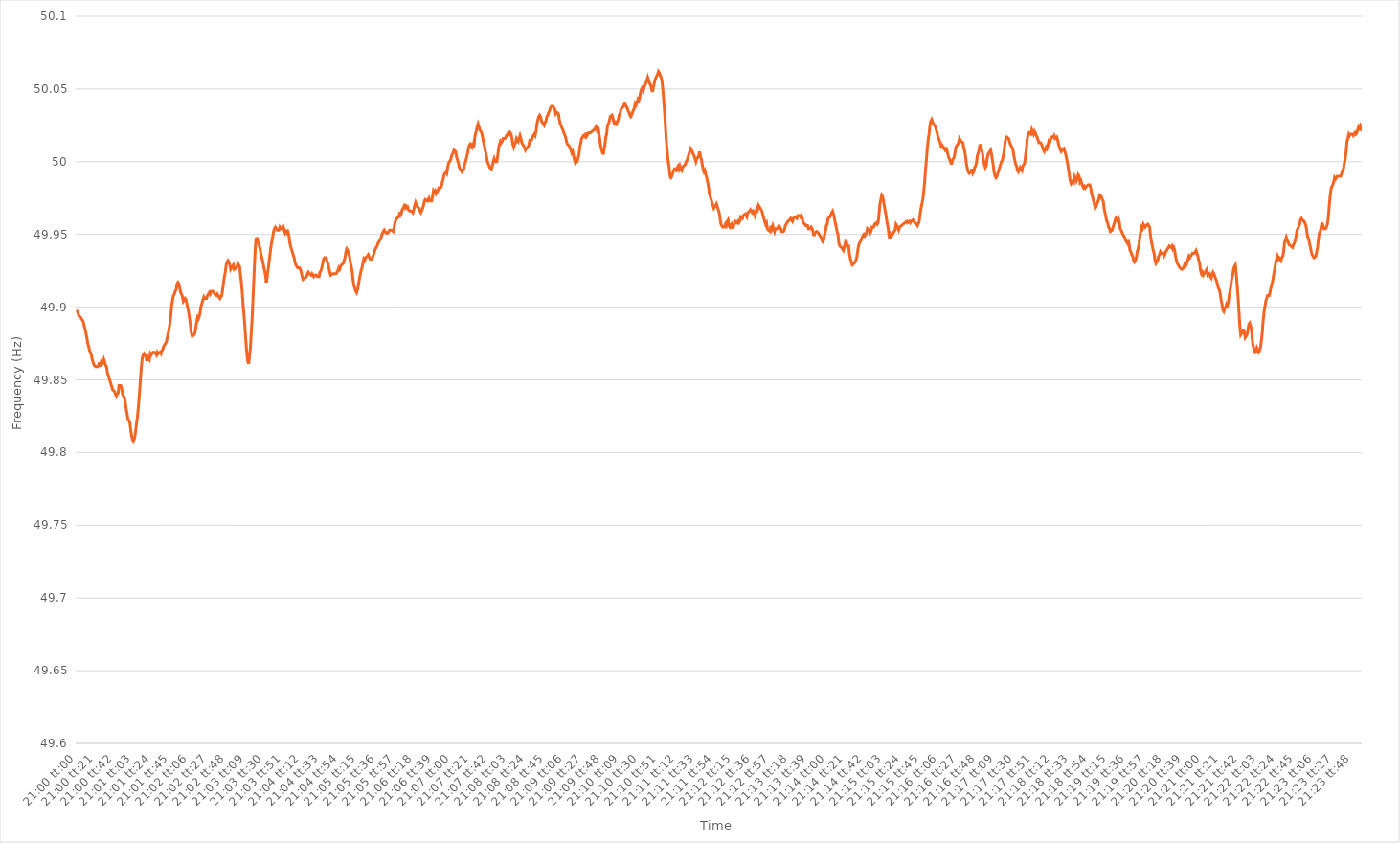
| Category | Series 0 |
|---|---|
| 0.875 | 49.898 |
| 0.8750115740740741 | 49.896 |
| 0.8750231481481481 | 49.894 |
| 0.8750347222222222 | 49.894 |
| 0.8750462962962963 | 49.893 |
| 0.8750578703703704 | 49.892 |
| 0.8750694444444443 | 49.891 |
| 0.8750810185185185 | 49.89 |
| 0.8750925925925926 | 49.887 |
| 0.8751041666666667 | 49.885 |
| 0.8751157407407407 | 49.882 |
| 0.8751273148148148 | 49.879 |
| 0.8751388888888889 | 49.875 |
| 0.8751504629629631 | 49.873 |
| 0.875162037037037 | 49.87 |
| 0.8751736111111111 | 49.869 |
| 0.8751851851851852 | 49.867 |
| 0.8751967592592593 | 49.864 |
| 0.8752083333333333 | 49.862 |
| 0.8752199074074074 | 49.86 |
| 0.8752314814814816 | 49.86 |
| 0.8752430555555555 | 49.859 |
| 0.8752546296296296 | 49.859 |
| 0.8752662037037037 | 49.859 |
| 0.8752777777777778 | 49.86 |
| 0.8752893518518517 | 49.862 |
| 0.8753009259259259 | 49.859 |
| 0.8753125 | 49.862 |
| 0.8753240740740741 | 49.861 |
| 0.8753356481481481 | 49.862 |
| 0.8753472222222222 | 49.864 |
| 0.8753587962962963 | 49.862 |
| 0.8753703703703705 | 49.86 |
| 0.8753819444444444 | 49.859 |
| 0.8753935185185185 | 49.855 |
| 0.8754050925925926 | 49.853 |
| 0.8754166666666667 | 49.851 |
| 0.8754282407407407 | 49.849 |
| 0.8754398148148148 | 49.847 |
| 0.875451388888889 | 49.845 |
| 0.875462962962963 | 49.843 |
| 0.875474537037037 | 49.843 |
| 0.8754861111111111 | 49.842 |
| 0.8754976851851852 | 49.84 |
| 0.8755092592592592 | 49.839 |
| 0.8755208333333333 | 49.84 |
| 0.8755324074074075 | 49.841 |
| 0.8755439814814815 | 49.846 |
| 0.8755555555555555 | 49.846 |
| 0.8755671296296296 | 49.846 |
| 0.8755787037037037 | 49.844 |
| 0.8755902777777779 | 49.84 |
| 0.8756018518518518 | 49.839 |
| 0.875613425925926 | 49.838 |
| 0.875625 | 49.835 |
| 0.8756365740740741 | 49.83 |
| 0.8756481481481481 | 49.827 |
| 0.8756597222222222 | 49.823 |
| 0.8756712962962964 | 49.823 |
| 0.8756828703703704 | 49.821 |
| 0.8756944444444444 | 49.816 |
| 0.8757060185185185 | 49.812 |
| 0.8757175925925926 | 49.809 |
| 0.8757291666666666 | 49.808 |
| 0.8757407407407407 | 49.809 |
| 0.8757523148148149 | 49.812 |
| 0.8757638888888889 | 49.817 |
| 0.8757754629629629 | 49.822 |
| 0.875787037037037 | 49.827 |
| 0.8757986111111111 | 49.834 |
| 0.8758101851851853 | 49.842 |
| 0.8758217592592592 | 49.851 |
| 0.8758333333333334 | 49.859 |
| 0.8758449074074074 | 49.865 |
| 0.8758564814814815 | 49.867 |
| 0.8758680555555555 | 49.868 |
| 0.8758796296296296 | 49.867 |
| 0.8758912037037038 | 49.866 |
| 0.8759027777777778 | 49.863 |
| 0.8759143518518518 | 49.866 |
| 0.8759259259259259 | 49.865 |
| 0.8759375 | 49.864 |
| 0.875949074074074 | 49.868 |
| 0.8759606481481481 | 49.867 |
| 0.8759722222222223 | 49.868 |
| 0.8759837962962963 | 49.869 |
| 0.8759953703703703 | 49.869 |
| 0.8760069444444444 | 49.869 |
| 0.8760185185185185 | 49.869 |
| 0.8760300925925927 | 49.867 |
| 0.8760416666666666 | 49.869 |
| 0.8760532407407408 | 49.868 |
| 0.8760648148148148 | 49.868 |
| 0.876076388888889 | 49.869 |
| 0.8760879629629629 | 49.868 |
| 0.876099537037037 | 49.87 |
| 0.8761111111111112 | 49.871 |
| 0.8761226851851852 | 49.873 |
| 0.8761342592592593 | 49.873 |
| 0.8761458333333333 | 49.875 |
| 0.8761574074074074 | 49.876 |
| 0.8761689814814816 | 49.879 |
| 0.8761805555555555 | 49.882 |
| 0.8761921296296297 | 49.885 |
| 0.8762037037037037 | 49.889 |
| 0.8762152777777777 | 49.894 |
| 0.8762268518518518 | 49.901 |
| 0.8762384259259259 | 49.905 |
| 0.8762500000000001 | 49.908 |
| 0.876261574074074 | 49.909 |
| 0.8762731481481482 | 49.911 |
| 0.8762847222222222 | 49.912 |
| 0.8762962962962964 | 49.916 |
| 0.8763078703703703 | 49.917 |
| 0.8763194444444444 | 49.916 |
| 0.8763310185185186 | 49.913 |
| 0.8763425925925926 | 49.91 |
| 0.8763541666666667 | 49.909 |
| 0.8763657407407407 | 49.907 |
| 0.8763773148148148 | 49.904 |
| 0.876388888888889 | 49.905 |
| 0.8764004629629629 | 49.906 |
| 0.8764120370370371 | 49.905 |
| 0.8764236111111111 | 49.902 |
| 0.8764351851851852 | 49.899 |
| 0.8764467592592592 | 49.896 |
| 0.8764583333333333 | 49.892 |
| 0.8764699074074075 | 49.887 |
| 0.8764814814814814 | 49.882 |
| 0.8764930555555556 | 49.88 |
| 0.8765046296296296 | 49.88 |
| 0.8765162037037038 | 49.881 |
| 0.8765277777777777 | 49.882 |
| 0.8765393518518518 | 49.886 |
| 0.876550925925926 | 49.89 |
| 0.8765625 | 49.893 |
| 0.8765740740740741 | 49.892 |
| 0.8765856481481481 | 49.894 |
| 0.8765972222222222 | 49.897 |
| 0.8766087962962964 | 49.901 |
| 0.8766203703703703 | 49.903 |
| 0.8766319444444445 | 49.905 |
| 0.8766435185185185 | 49.907 |
| 0.8766550925925927 | 49.906 |
| 0.8766666666666666 | 49.906 |
| 0.8766782407407407 | 49.906 |
| 0.8766898148148149 | 49.908 |
| 0.8767013888888888 | 49.909 |
| 0.876712962962963 | 49.91 |
| 0.876724537037037 | 49.909 |
| 0.8767361111111112 | 49.911 |
| 0.8767476851851851 | 49.911 |
| 0.8767592592592592 | 49.911 |
| 0.8767708333333334 | 49.911 |
| 0.8767824074074074 | 49.909 |
| 0.8767939814814815 | 49.909 |
| 0.8768055555555555 | 49.908 |
| 0.8768171296296297 | 49.909 |
| 0.8768287037037038 | 49.909 |
| 0.8768402777777777 | 49.907 |
| 0.8768518518518519 | 49.906 |
| 0.8768634259259259 | 49.906 |
| 0.8768750000000001 | 49.908 |
| 0.876886574074074 | 49.912 |
| 0.8768981481481481 | 49.917 |
| 0.8769097222222223 | 49.921 |
| 0.8769212962962962 | 49.924 |
| 0.8769328703703704 | 49.929 |
| 0.8769444444444444 | 49.931 |
| 0.8769560185185186 | 49.932 |
| 0.8769675925925925 | 49.931 |
| 0.8769791666666666 | 49.929 |
| 0.8769907407407408 | 49.926 |
| 0.8770023148148148 | 49.926 |
| 0.8770138888888889 | 49.928 |
| 0.8770254629629629 | 49.929 |
| 0.8770370370370371 | 49.926 |
| 0.8770486111111112 | 49.926 |
| 0.8770601851851851 | 49.927 |
| 0.8770717592592593 | 49.928 |
| 0.8770833333333333 | 49.93 |
| 0.8770949074074075 | 49.93 |
| 0.8771064814814814 | 49.928 |
| 0.8771180555555556 | 49.922 |
| 0.8771296296296297 | 49.917 |
| 0.8771412037037036 | 49.91 |
| 0.8771527777777778 | 49.901 |
| 0.8771643518518518 | 49.894 |
| 0.877175925925926 | 49.886 |
| 0.8771874999999999 | 49.877 |
| 0.877199074074074 | 49.869 |
| 0.8772106481481482 | 49.863 |
| 0.8772222222222222 | 49.861 |
| 0.8772337962962963 | 49.867 |
| 0.8772453703703703 | 49.871 |
| 0.8772569444444445 | 49.882 |
| 0.8772685185185186 | 49.892 |
| 0.8772800925925925 | 49.906 |
| 0.8772916666666667 | 49.92 |
| 0.8773032407407407 | 49.934 |
| 0.8773148148148149 | 49.945 |
| 0.8773263888888888 | 49.948 |
| 0.877337962962963 | 49.946 |
| 0.8773495370370371 | 49.944 |
| 0.8773611111111111 | 49.942 |
| 0.8773726851851852 | 49.94 |
| 0.8773842592592592 | 49.936 |
| 0.8773958333333334 | 49.934 |
| 0.8774074074074073 | 49.931 |
| 0.8774189814814815 | 49.928 |
| 0.8774305555555556 | 49.925 |
| 0.8774421296296296 | 49.922 |
| 0.8774537037037037 | 49.917 |
| 0.8774652777777777 | 49.922 |
| 0.8774768518518519 | 49.926 |
| 0.877488425925926 | 49.931 |
| 0.8775 | 49.936 |
| 0.8775115740740741 | 49.941 |
| 0.8775231481481481 | 49.945 |
| 0.8775347222222223 | 49.948 |
| 0.8775462962962962 | 49.952 |
| 0.8775578703703704 | 49.954 |
| 0.8775694444444445 | 49.955 |
| 0.8775810185185186 | 49.954 |
| 0.8775925925925926 | 49.953 |
| 0.8776041666666666 | 49.953 |
| 0.8776157407407408 | 49.953 |
| 0.8776273148148147 | 49.955 |
| 0.8776388888888889 | 49.954 |
| 0.877650462962963 | 49.954 |
| 0.877662037037037 | 49.954 |
| 0.8776736111111111 | 49.955 |
| 0.8776851851851851 | 49.955 |
| 0.8776967592592593 | 49.951 |
| 0.8777083333333334 | 49.952 |
| 0.8777199074074074 | 49.951 |
| 0.8777314814814815 | 49.952 |
| 0.8777430555555555 | 49.95 |
| 0.8777546296296297 | 49.945 |
| 0.8777662037037036 | 49.942 |
| 0.8777777777777778 | 49.94 |
| 0.8777893518518519 | 49.938 |
| 0.877800925925926 | 49.936 |
| 0.8778125 | 49.934 |
| 0.877824074074074 | 49.931 |
| 0.8778356481481482 | 49.929 |
| 0.8778472222222221 | 49.928 |
| 0.8778587962962963 | 49.927 |
| 0.8778703703703704 | 49.927 |
| 0.8778819444444445 | 49.927 |
| 0.8778935185185185 | 49.926 |
| 0.8779050925925925 | 49.924 |
| 0.8779166666666667 | 49.921 |
| 0.8779282407407408 | 49.919 |
| 0.8779398148148148 | 49.919 |
| 0.8779513888888889 | 49.92 |
| 0.877962962962963 | 49.92 |
| 0.8779745370370371 | 49.921 |
| 0.877986111111111 | 49.923 |
| 0.8779976851851852 | 49.924 |
| 0.8780092592592593 | 49.923 |
| 0.8780208333333334 | 49.923 |
| 0.8780324074074074 | 49.922 |
| 0.8780439814814814 | 49.923 |
| 0.8780555555555556 | 49.923 |
| 0.8780671296296297 | 49.921 |
| 0.8780787037037037 | 49.922 |
| 0.8780902777777778 | 49.922 |
| 0.8781018518518519 | 49.922 |
| 0.8781134259259259 | 49.921 |
| 0.8781249999999999 | 49.921 |
| 0.8781365740740741 | 49.921 |
| 0.8781481481481482 | 49.924 |
| 0.8781597222222222 | 49.925 |
| 0.8781712962962963 | 49.927 |
| 0.8781828703703703 | 49.93 |
| 0.8781944444444445 | 49.933 |
| 0.8782060185185184 | 49.934 |
| 0.8782175925925926 | 49.934 |
| 0.8782291666666667 | 49.934 |
| 0.8782407407407408 | 49.931 |
| 0.8782523148148148 | 49.93 |
| 0.8782638888888888 | 49.927 |
| 0.878275462962963 | 49.924 |
| 0.8782870370370371 | 49.922 |
| 0.8782986111111111 | 49.922 |
| 0.8783101851851852 | 49.923 |
| 0.8783217592592593 | 49.923 |
| 0.8783333333333333 | 49.923 |
| 0.8783449074074073 | 49.923 |
| 0.8783564814814815 | 49.923 |
| 0.8783680555555556 | 49.923 |
| 0.8783796296296296 | 49.925 |
| 0.8783912037037037 | 49.927 |
| 0.8784027777777778 | 49.926 |
| 0.8784143518518519 | 49.928 |
| 0.8784259259259258 | 49.929 |
| 0.8784375 | 49.929 |
| 0.8784490740740741 | 49.93 |
| 0.8784606481481482 | 49.932 |
| 0.8784722222222222 | 49.934 |
| 0.8784837962962962 | 49.938 |
| 0.8784953703703704 | 49.94 |
| 0.8785069444444445 | 49.939 |
| 0.8785185185185185 | 49.937 |
| 0.8785300925925926 | 49.935 |
| 0.8785416666666667 | 49.931 |
| 0.8785532407407407 | 49.928 |
| 0.8785648148148147 | 49.925 |
| 0.8785763888888889 | 49.919 |
| 0.878587962962963 | 49.915 |
| 0.878599537037037 | 49.913 |
| 0.8786111111111111 | 49.911 |
| 0.8786226851851852 | 49.91 |
| 0.8786342592592593 | 49.912 |
| 0.8786458333333332 | 49.915 |
| 0.8786574074074074 | 49.919 |
| 0.8786689814814815 | 49.922 |
| 0.8786805555555556 | 49.925 |
| 0.8786921296296296 | 49.927 |
| 0.8787037037037037 | 49.93 |
| 0.8787152777777778 | 49.933 |
| 0.878726851851852 | 49.932 |
| 0.8787384259259259 | 49.934 |
| 0.87875 | 49.934 |
| 0.8787615740740741 | 49.935 |
| 0.8787731481481482 | 49.936 |
| 0.8787847222222221 | 49.936 |
| 0.8787962962962963 | 49.933 |
| 0.8788078703703704 | 49.933 |
| 0.8788194444444444 | 49.933 |
| 0.8788310185185185 | 49.933 |
| 0.8788425925925926 | 49.936 |
| 0.8788541666666667 | 49.938 |
| 0.8788657407407406 | 49.94 |
| 0.8788773148148148 | 49.941 |
| 0.8788888888888889 | 49.942 |
| 0.878900462962963 | 49.944 |
| 0.878912037037037 | 49.945 |
| 0.8789236111111111 | 49.945 |
| 0.8789351851851852 | 49.947 |
| 0.8789467592592594 | 49.949 |
| 0.8789583333333333 | 49.951 |
| 0.8789699074074074 | 49.952 |
| 0.8789814814814815 | 49.953 |
| 0.8789930555555556 | 49.953 |
| 0.8790046296296296 | 49.951 |
| 0.8790162037037037 | 49.951 |
| 0.8790277777777779 | 49.951 |
| 0.8790393518518518 | 49.951 |
| 0.8790509259259259 | 49.953 |
| 0.8790625 | 49.953 |
| 0.8790740740740741 | 49.953 |
| 0.879085648148148 | 49.953 |
| 0.8790972222222222 | 49.952 |
| 0.8791087962962963 | 49.955 |
| 0.8791203703703704 | 49.958 |
| 0.8791319444444444 | 49.96 |
| 0.8791435185185185 | 49.961 |
| 0.8791550925925926 | 49.961 |
| 0.8791666666666668 | 49.962 |
| 0.8791782407407407 | 49.964 |
| 0.8791898148148148 | 49.963 |
| 0.8792013888888889 | 49.964 |
| 0.879212962962963 | 49.967 |
| 0.879224537037037 | 49.968 |
| 0.8792361111111111 | 49.969 |
| 0.8792476851851853 | 49.971 |
| 0.8792592592592593 | 49.968 |
| 0.8792708333333333 | 49.968 |
| 0.8792824074074074 | 49.969 |
| 0.8792939814814815 | 49.967 |
| 0.8793055555555555 | 49.967 |
| 0.8793171296296296 | 49.966 |
| 0.8793287037037038 | 49.966 |
| 0.8793402777777778 | 49.966 |
| 0.8793518518518518 | 49.965 |
| 0.8793634259259259 | 49.967 |
| 0.879375 | 49.97 |
| 0.8793865740740742 | 49.972 |
| 0.8793981481481481 | 49.972 |
| 0.8794097222222222 | 49.969 |
| 0.8794212962962963 | 49.969 |
| 0.8794328703703704 | 49.968 |
| 0.8794444444444444 | 49.966 |
| 0.8794560185185185 | 49.965 |
| 0.8794675925925927 | 49.965 |
| 0.8794791666666667 | 49.968 |
| 0.8794907407407407 | 49.97 |
| 0.8795023148148148 | 49.973 |
| 0.8795138888888889 | 49.974 |
| 0.8795254629629629 | 49.974 |
| 0.879537037037037 | 49.973 |
| 0.8795486111111112 | 49.974 |
| 0.8795601851851852 | 49.975 |
| 0.8795717592592592 | 49.973 |
| 0.8795833333333333 | 49.973 |
| 0.8795949074074074 | 49.973 |
| 0.8796064814814816 | 49.976 |
| 0.8796180555555555 | 49.98 |
| 0.8796296296296297 | 49.979 |
| 0.8796412037037037 | 49.98 |
| 0.8796527777777778 | 49.978 |
| 0.8796643518518518 | 49.979 |
| 0.8796759259259259 | 49.98 |
| 0.8796875000000001 | 49.982 |
| 0.8796990740740741 | 49.982 |
| 0.8797106481481481 | 49.982 |
| 0.8797222222222222 | 49.983 |
| 0.8797337962962963 | 49.986 |
| 0.8797453703703703 | 49.988 |
| 0.8797569444444444 | 49.991 |
| 0.8797685185185186 | 49.991 |
| 0.8797800925925926 | 49.993 |
| 0.8797916666666666 | 49.992 |
| 0.8798032407407407 | 49.996 |
| 0.8798148148148148 | 49.999 |
| 0.879826388888889 | 50 |
| 0.8798379629629629 | 50.001 |
| 0.879849537037037 | 50.003 |
| 0.8798611111111111 | 50.005 |
| 0.8798726851851852 | 50.006 |
| 0.8798842592592592 | 50.008 |
| 0.8798958333333333 | 50.008 |
| 0.8799074074074075 | 50.007 |
| 0.8799189814814815 | 50.003 |
| 0.8799305555555555 | 50.001 |
| 0.8799421296296296 | 49.999 |
| 0.8799537037037037 | 49.996 |
| 0.8799652777777779 | 49.995 |
| 0.8799768518518518 | 49.995 |
| 0.879988425925926 | 49.993 |
| 0.88 | 49.994 |
| 0.880011574074074 | 49.995 |
| 0.8800231481481481 | 49.998 |
| 0.8800347222222222 | 50 |
| 0.8800462962962964 | 50 |
| 0.8800578703703703 | 50.005 |
| 0.8800694444444445 | 50.008 |
| 0.8800810185185185 | 50.011 |
| 0.8800925925925926 | 50.012 |
| 0.8801041666666666 | 50.012 |
| 0.8801157407407407 | 50.01 |
| 0.8801273148148149 | 50.013 |
| 0.8801388888888889 | 50.01 |
| 0.880150462962963 | 50.015 |
| 0.880162037037037 | 50.019 |
| 0.8801736111111111 | 50.021 |
| 0.8801851851851853 | 50.024 |
| 0.8801967592592592 | 50.026 |
| 0.8802083333333334 | 50.024 |
| 0.8802199074074074 | 50.022 |
| 0.8802314814814814 | 50.021 |
| 0.8802430555555555 | 50.02 |
| 0.8802546296296296 | 50.017 |
| 0.8802662037037038 | 50.014 |
| 0.8802777777777777 | 50.011 |
| 0.8802893518518519 | 50.008 |
| 0.8803009259259259 | 50.005 |
| 0.8803125 | 50.002 |
| 0.880324074074074 | 49.999 |
| 0.8803356481481481 | 49.998 |
| 0.8803472222222223 | 49.996 |
| 0.8803587962962963 | 49.996 |
| 0.8803703703703704 | 49.995 |
| 0.8803819444444444 | 49.997 |
| 0.8803935185185185 | 50 |
| 0.8804050925925927 | 50.002 |
| 0.8804166666666666 | 50 |
| 0.8804282407407408 | 50 |
| 0.8804398148148148 | 50 |
| 0.8804513888888889 | 50.004 |
| 0.8804629629629629 | 50.009 |
| 0.880474537037037 | 50.012 |
| 0.8804861111111112 | 50.014 |
| 0.8804976851851851 | 50.013 |
| 0.8805092592592593 | 50.014 |
| 0.8805208333333333 | 50.016 |
| 0.8805324074074075 | 50.016 |
| 0.8805439814814814 | 50.016 |
| 0.8805555555555555 | 50.017 |
| 0.8805671296296297 | 50.018 |
| 0.8805787037037037 | 50.019 |
| 0.8805902777777778 | 50.02 |
| 0.8806018518518518 | 50.019 |
| 0.880613425925926 | 50.02 |
| 0.8806250000000001 | 50.019 |
| 0.880636574074074 | 50.016 |
| 0.8806481481481482 | 50.012 |
| 0.8806597222222222 | 50.01 |
| 0.8806712962962964 | 50.012 |
| 0.8806828703703703 | 50.013 |
| 0.8806944444444444 | 50.016 |
| 0.8807060185185186 | 50.015 |
| 0.8807175925925925 | 50.014 |
| 0.8807291666666667 | 50.016 |
| 0.8807407407407407 | 50.018 |
| 0.8807523148148149 | 50.016 |
| 0.8807638888888888 | 50.013 |
| 0.8807754629629629 | 50.012 |
| 0.8807870370370371 | 50.012 |
| 0.8807986111111111 | 50.01 |
| 0.8808101851851852 | 50.008 |
| 0.8808217592592592 | 50.009 |
| 0.8808333333333334 | 50.009 |
| 0.8808449074074075 | 50.01 |
| 0.8808564814814814 | 50.012 |
| 0.8808680555555556 | 50.015 |
| 0.8808796296296296 | 50.015 |
| 0.8808912037037038 | 50.015 |
| 0.8809027777777777 | 50.017 |
| 0.8809143518518519 | 50.018 |
| 0.880925925925926 | 50.019 |
| 0.8809374999999999 | 50.018 |
| 0.8809490740740741 | 50.021 |
| 0.8809606481481481 | 50.026 |
| 0.8809722222222223 | 50.029 |
| 0.8809837962962962 | 50.031 |
| 0.8809953703703703 | 50.032 |
| 0.8810069444444445 | 50.031 |
| 0.8810185185185185 | 50.028 |
| 0.8810300925925926 | 50.027 |
| 0.8810416666666666 | 50.026 |
| 0.8810532407407408 | 50.025 |
| 0.8810648148148149 | 50.027 |
| 0.8810763888888888 | 50.028 |
| 0.881087962962963 | 50.031 |
| 0.881099537037037 | 50.032 |
| 0.8811111111111112 | 50.032 |
| 0.8811226851851851 | 50.035 |
| 0.8811342592592593 | 50.037 |
| 0.8811458333333334 | 50.038 |
| 0.8811574074074073 | 50.038 |
| 0.8811689814814815 | 50.038 |
| 0.8811805555555555 | 50.037 |
| 0.8811921296296297 | 50.036 |
| 0.8812037037037036 | 50.033 |
| 0.8812152777777778 | 50.034 |
| 0.8812268518518519 | 50.034 |
| 0.8812384259259259 | 50.033 |
| 0.88125 | 50.029 |
| 0.881261574074074 | 50.026 |
| 0.8812731481481482 | 50.025 |
| 0.8812847222222223 | 50.023 |
| 0.8812962962962962 | 50.022 |
| 0.8813078703703704 | 50.02 |
| 0.8813194444444444 | 50.02 |
| 0.8813310185185186 | 50.017 |
| 0.8813425925925925 | 50.014 |
| 0.8813541666666667 | 50.012 |
| 0.8813657407407408 | 50.012 |
| 0.8813773148148148 | 50.011 |
| 0.8813888888888889 | 50.009 |
| 0.8814004629629629 | 50.008 |
| 0.8814120370370371 | 50.006 |
| 0.881423611111111 | 50.007 |
| 0.8814351851851852 | 50.007 |
| 0.8814467592592593 | 50.001 |
| 0.8814583333333333 | 49.999 |
| 0.8814699074074074 | 49.999 |
| 0.8814814814814814 | 50 |
| 0.8814930555555556 | 50 |
| 0.8815046296296297 | 50.005 |
| 0.8815162037037036 | 50.01 |
| 0.8815277777777778 | 50.013 |
| 0.8815393518518518 | 50.016 |
| 0.881550925925926 | 50.016 |
| 0.8815624999999999 | 50.018 |
| 0.8815740740740741 | 50.018 |
| 0.8815856481481482 | 50.017 |
| 0.8815972222222223 | 50.02 |
| 0.8816087962962963 | 50.018 |
| 0.8816203703703703 | 50.018 |
| 0.8816319444444445 | 50.02 |
| 0.8816435185185184 | 50.02 |
| 0.8816550925925926 | 50.02 |
| 0.8816666666666667 | 50.02 |
| 0.8816782407407407 | 50.021 |
| 0.8816898148148148 | 50.021 |
| 0.8817013888888888 | 50.022 |
| 0.881712962962963 | 50.022 |
| 0.8817245370370371 | 50.024 |
| 0.881736111111111 | 50.022 |
| 0.8817476851851852 | 50.024 |
| 0.8817592592592592 | 50.021 |
| 0.8817708333333334 | 50.017 |
| 0.8817824074074073 | 50.012 |
| 0.8817939814814815 | 50.009 |
| 0.8818055555555556 | 50.007 |
| 0.8818171296296297 | 50.005 |
| 0.8818287037037037 | 50.008 |
| 0.8818402777777777 | 50.011 |
| 0.8818518518518519 | 50.017 |
| 0.881863425925926 | 50.019 |
| 0.881875 | 50.025 |
| 0.8818865740740741 | 50.026 |
| 0.8818981481481482 | 50.028 |
| 0.8819097222222222 | 50.031 |
| 0.8819212962962962 | 50.031 |
| 0.8819328703703704 | 50.032 |
| 0.8819444444444445 | 50.03 |
| 0.8819560185185185 | 50.027 |
| 0.8819675925925926 | 50.026 |
| 0.8819791666666666 | 50.027 |
| 0.8819907407407408 | 50.026 |
| 0.8820023148148147 | 50.026 |
| 0.8820138888888889 | 50.029 |
| 0.882025462962963 | 50.032 |
| 0.8820370370370371 | 50.033 |
| 0.8820486111111111 | 50.036 |
| 0.8820601851851851 | 50.037 |
| 0.8820717592592593 | 50.037 |
| 0.8820833333333334 | 50.038 |
| 0.8820949074074074 | 50.041 |
| 0.8821064814814815 | 50.039 |
| 0.8821180555555556 | 50.039 |
| 0.8821296296296296 | 50.037 |
| 0.8821412037037036 | 50.035 |
| 0.8821527777777778 | 50.034 |
| 0.8821643518518519 | 50.032 |
| 0.8821759259259259 | 50.031 |
| 0.8821875 | 50.032 |
| 0.882199074074074 | 50.034 |
| 0.8822106481481482 | 50.034 |
| 0.8822222222222221 | 50.037 |
| 0.8822337962962963 | 50.04 |
| 0.8822453703703704 | 50.039 |
| 0.8822569444444445 | 50.039 |
| 0.8822685185185185 | 50.043 |
| 0.8822800925925925 | 50.042 |
| 0.8822916666666667 | 50.044 |
| 0.8823032407407408 | 50.048 |
| 0.8823148148148148 | 50.05 |
| 0.8823263888888889 | 50.051 |
| 0.882337962962963 | 50.049 |
| 0.882349537037037 | 50.051 |
| 0.882361111111111 | 50.053 |
| 0.8823726851851852 | 50.054 |
| 0.8823842592592593 | 50.056 |
| 0.8823958333333333 | 50.058 |
| 0.8824074074074074 | 50.058 |
| 0.8824189814814815 | 50.054 |
| 0.8824305555555556 | 50.053 |
| 0.8824421296296295 | 50.051 |
| 0.8824537037037037 | 50.048 |
| 0.8824652777777778 | 50.05 |
| 0.8824768518518519 | 50.053 |
| 0.8824884259259259 | 50.056 |
| 0.8825 | 50.056 |
| 0.8825115740740741 | 50.059 |
| 0.8825231481481483 | 50.06 |
| 0.8825347222222222 | 50.062 |
| 0.8825462962962963 | 50.061 |
| 0.8825578703703704 | 50.061 |
| 0.8825694444444445 | 50.058 |
| 0.8825810185185184 | 50.055 |
| 0.8825925925925926 | 50.049 |
| 0.8826041666666667 | 50.041 |
| 0.8826157407407407 | 50.033 |
| 0.8826273148148148 | 50.022 |
| 0.8826388888888889 | 50.013 |
| 0.882650462962963 | 50.006 |
| 0.8826620370370369 | 50 |
| 0.8826736111111111 | 49.996 |
| 0.8826851851851852 | 49.99 |
| 0.8826967592592593 | 49.989 |
| 0.8827083333333333 | 49.99 |
| 0.8827199074074074 | 49.99 |
| 0.8827314814814815 | 49.994 |
| 0.8827430555555557 | 49.995 |
| 0.8827546296296296 | 49.995 |
| 0.8827662037037037 | 49.994 |
| 0.8827777777777778 | 49.996 |
| 0.8827893518518519 | 49.997 |
| 0.8828009259259259 | 49.995 |
| 0.8828125 | 49.997 |
| 0.8828240740740741 | 49.995 |
| 0.8828356481481481 | 49.994 |
| 0.8828472222222222 | 49.996 |
| 0.8828587962962963 | 49.997 |
| 0.8828703703703704 | 49.997 |
| 0.8828819444444443 | 49.998 |
| 0.8828935185185185 | 50 |
| 0.8829050925925926 | 50.001 |
| 0.8829166666666667 | 50.003 |
| 0.8829282407407407 | 50.005 |
| 0.8829398148148148 | 50.005 |
| 0.8829513888888889 | 50.009 |
| 0.8829629629629631 | 50.009 |
| 0.882974537037037 | 50.007 |
| 0.8829861111111111 | 50.005 |
| 0.8829976851851852 | 50.004 |
| 0.8830092592592593 | 50.002 |
| 0.8830208333333333 | 50 |
| 0.8830324074074074 | 50.002 |
| 0.8830439814814816 | 50.003 |
| 0.8830555555555555 | 50.004 |
| 0.8830671296296296 | 50.007 |
| 0.8830787037037037 | 50.003 |
| 0.8830902777777778 | 50.002 |
| 0.8831018518518517 | 49.998 |
| 0.8831134259259259 | 49.995 |
| 0.883125 | 49.993 |
| 0.8831365740740741 | 49.994 |
| 0.8831481481481481 | 49.991 |
| 0.8831597222222222 | 49.989 |
| 0.8831712962962963 | 49.986 |
| 0.8831828703703705 | 49.983 |
| 0.8831944444444444 | 49.978 |
| 0.8832060185185185 | 49.978 |
| 0.8832175925925926 | 49.974 |
| 0.8832291666666667 | 49.972 |
| 0.8832407407407407 | 49.97 |
| 0.8832523148148148 | 49.968 |
| 0.883263888888889 | 49.968 |
| 0.883275462962963 | 49.97 |
| 0.883287037037037 | 49.971 |
| 0.8832986111111111 | 49.969 |
| 0.8833101851851852 | 49.969 |
| 0.8833217592592592 | 49.965 |
| 0.8833333333333333 | 49.961 |
| 0.8833449074074075 | 49.957 |
| 0.8833564814814815 | 49.956 |
| 0.8833680555555555 | 49.955 |
| 0.8833796296296296 | 49.955 |
| 0.8833912037037037 | 49.955 |
| 0.8834027777777779 | 49.957 |
| 0.8834143518518518 | 49.956 |
| 0.883425925925926 | 49.959 |
| 0.8834375 | 49.96 |
| 0.8834490740740741 | 49.956 |
| 0.8834606481481481 | 49.955 |
| 0.8834722222222222 | 49.956 |
| 0.8834837962962964 | 49.957 |
| 0.8834953703703704 | 49.954 |
| 0.8835069444444444 | 49.956 |
| 0.8835185185185185 | 49.957 |
| 0.8835300925925926 | 49.959 |
| 0.8835416666666666 | 49.959 |
| 0.8835532407407407 | 49.958 |
| 0.8835648148148149 | 49.959 |
| 0.8835763888888889 | 49.958 |
| 0.8835879629629629 | 49.959 |
| 0.883599537037037 | 49.962 |
| 0.8836111111111111 | 49.962 |
| 0.8836226851851853 | 49.961 |
| 0.8836342592592592 | 49.963 |
| 0.8836458333333334 | 49.963 |
| 0.8836574074074074 | 49.964 |
| 0.8836689814814815 | 49.963 |
| 0.8836805555555555 | 49.962 |
| 0.8836921296296296 | 49.965 |
| 0.8837037037037038 | 49.965 |
| 0.8837152777777778 | 49.966 |
| 0.8837268518518518 | 49.967 |
| 0.8837384259259259 | 49.967 |
| 0.88375 | 49.965 |
| 0.883761574074074 | 49.966 |
| 0.8837731481481481 | 49.965 |
| 0.8837847222222223 | 49.963 |
| 0.8837962962962963 | 49.965 |
| 0.8838078703703703 | 49.968 |
| 0.8838194444444444 | 49.967 |
| 0.8838310185185185 | 49.97 |
| 0.8838425925925927 | 49.97 |
| 0.8838541666666666 | 49.968 |
| 0.8838657407407408 | 49.967 |
| 0.8838773148148148 | 49.966 |
| 0.883888888888889 | 49.963 |
| 0.8839004629629629 | 49.963 |
| 0.883912037037037 | 49.959 |
| 0.8839236111111112 | 49.957 |
| 0.8839351851851852 | 49.958 |
| 0.8839467592592593 | 49.954 |
| 0.8839583333333333 | 49.953 |
| 0.8839699074074074 | 49.953 |
| 0.8839814814814816 | 49.952 |
| 0.8839930555555555 | 49.956 |
| 0.8840046296296297 | 49.954 |
| 0.8840162037037037 | 49.956 |
| 0.8840277777777777 | 49.954 |
| 0.8840393518518518 | 49.952 |
| 0.8840509259259259 | 49.954 |
| 0.8840625000000001 | 49.954 |
| 0.884074074074074 | 49.954 |
| 0.8840856481481482 | 49.955 |
| 0.8840972222222222 | 49.956 |
| 0.8841087962962964 | 49.955 |
| 0.8841203703703703 | 49.954 |
| 0.8841319444444444 | 49.952 |
| 0.8841435185185186 | 49.952 |
| 0.8841550925925926 | 49.952 |
| 0.8841666666666667 | 49.953 |
| 0.8841782407407407 | 49.956 |
| 0.8841898148148148 | 49.957 |
| 0.884201388888889 | 49.957 |
| 0.8842129629629629 | 49.959 |
| 0.8842245370370371 | 49.959 |
| 0.8842361111111111 | 49.96 |
| 0.8842476851851852 | 49.961 |
| 0.8842592592592592 | 49.961 |
| 0.8842708333333333 | 49.959 |
| 0.8842824074074075 | 49.961 |
| 0.8842939814814814 | 49.961 |
| 0.8843055555555556 | 49.962 |
| 0.8843171296296296 | 49.962 |
| 0.8843287037037038 | 49.961 |
| 0.8843402777777777 | 49.963 |
| 0.8843518518518518 | 49.963 |
| 0.884363425925926 | 49.963 |
| 0.884375 | 49.962 |
| 0.8843865740740741 | 49.963 |
| 0.8843981481481481 | 49.961 |
| 0.8844097222222222 | 49.958 |
| 0.8844212962962964 | 49.958 |
| 0.8844328703703703 | 49.957 |
| 0.8844444444444445 | 49.956 |
| 0.8844560185185185 | 49.956 |
| 0.8844675925925927 | 49.956 |
| 0.8844791666666666 | 49.954 |
| 0.8844907407407407 | 49.954 |
| 0.8845023148148149 | 49.954 |
| 0.8845138888888888 | 49.955 |
| 0.884525462962963 | 49.954 |
| 0.884537037037037 | 49.952 |
| 0.8845486111111112 | 49.949 |
| 0.8845601851851851 | 49.951 |
| 0.8845717592592592 | 49.951 |
| 0.8845833333333334 | 49.952 |
| 0.8845949074074074 | 49.952 |
| 0.8846064814814815 | 49.951 |
| 0.8846180555555555 | 49.95 |
| 0.8846296296296297 | 49.949 |
| 0.8846412037037038 | 49.948 |
| 0.8846527777777777 | 49.946 |
| 0.8846643518518519 | 49.945 |
| 0.8846759259259259 | 49.946 |
| 0.8846875000000001 | 49.95 |
| 0.884699074074074 | 49.952 |
| 0.8847106481481481 | 49.956 |
| 0.8847222222222223 | 49.957 |
| 0.8847337962962962 | 49.961 |
| 0.8847453703703704 | 49.961 |
| 0.8847569444444444 | 49.962 |
| 0.8847685185185186 | 49.962 |
| 0.8847800925925925 | 49.965 |
| 0.8847916666666666 | 49.966 |
| 0.8848032407407408 | 49.964 |
| 0.8848148148148148 | 49.961 |
| 0.8848263888888889 | 49.958 |
| 0.8848379629629629 | 49.955 |
| 0.8848495370370371 | 49.952 |
| 0.8848611111111112 | 49.95 |
| 0.8848726851851851 | 49.944 |
| 0.8848842592592593 | 49.942 |
| 0.8848958333333333 | 49.942 |
| 0.8849074074074075 | 49.941 |
| 0.8849189814814814 | 49.94 |
| 0.8849305555555556 | 49.939 |
| 0.8849421296296297 | 49.941 |
| 0.8849537037037036 | 49.944 |
| 0.8849652777777778 | 49.946 |
| 0.8849768518518518 | 49.942 |
| 0.884988425925926 | 49.942 |
| 0.8849999999999999 | 49.942 |
| 0.885011574074074 | 49.936 |
| 0.8850231481481482 | 49.933 |
| 0.8850347222222222 | 49.931 |
| 0.8850462962962963 | 49.929 |
| 0.8850578703703703 | 49.929 |
| 0.8850694444444445 | 49.93 |
| 0.8850810185185186 | 49.931 |
| 0.8850925925925925 | 49.932 |
| 0.8851041666666667 | 49.934 |
| 0.8851157407407407 | 49.938 |
| 0.8851273148148149 | 49.942 |
| 0.8851388888888888 | 49.944 |
| 0.885150462962963 | 49.945 |
| 0.8851620370370371 | 49.946 |
| 0.8851736111111111 | 49.948 |
| 0.8851851851851852 | 49.949 |
| 0.8851967592592592 | 49.95 |
| 0.8852083333333334 | 49.949 |
| 0.8852199074074073 | 49.95 |
| 0.8852314814814815 | 49.951 |
| 0.8852430555555556 | 49.954 |
| 0.8852546296296296 | 49.954 |
| 0.8852662037037037 | 49.953 |
| 0.8852777777777777 | 49.951 |
| 0.8852893518518519 | 49.952 |
| 0.885300925925926 | 49.955 |
| 0.8853125 | 49.955 |
| 0.8853240740740741 | 49.955 |
| 0.8853356481481481 | 49.957 |
| 0.8853472222222223 | 49.957 |
| 0.8853587962962962 | 49.958 |
| 0.8853703703703704 | 49.957 |
| 0.8853819444444445 | 49.958 |
| 0.8853935185185186 | 49.964 |
| 0.8854050925925926 | 49.971 |
| 0.8854166666666666 | 49.974 |
| 0.8854282407407408 | 49.977 |
| 0.8854398148148147 | 49.976 |
| 0.8854513888888889 | 49.973 |
| 0.885462962962963 | 49.969 |
| 0.885474537037037 | 49.966 |
| 0.8854861111111111 | 49.962 |
| 0.8854976851851851 | 49.958 |
| 0.8855092592592593 | 49.955 |
| 0.8855208333333334 | 49.95 |
| 0.8855324074074074 | 49.947 |
| 0.8855439814814815 | 49.95 |
| 0.8855555555555555 | 49.949 |
| 0.8855671296296297 | 49.95 |
| 0.8855787037037036 | 49.951 |
| 0.8855902777777778 | 49.952 |
| 0.8856018518518519 | 49.953 |
| 0.885613425925926 | 49.957 |
| 0.885625 | 49.956 |
| 0.885636574074074 | 49.956 |
| 0.8856481481481482 | 49.953 |
| 0.8856597222222221 | 49.955 |
| 0.8856712962962963 | 49.955 |
| 0.8856828703703704 | 49.956 |
| 0.8856944444444445 | 49.956 |
| 0.8857060185185185 | 49.957 |
| 0.8857175925925925 | 49.957 |
| 0.8857291666666667 | 49.958 |
| 0.8857407407407408 | 49.958 |
| 0.8857523148148148 | 49.959 |
| 0.8857638888888889 | 49.958 |
| 0.885775462962963 | 49.958 |
| 0.8857870370370371 | 49.959 |
| 0.885798611111111 | 49.958 |
| 0.8858101851851852 | 49.959 |
| 0.8858217592592593 | 49.959 |
| 0.8858333333333334 | 49.96 |
| 0.8858449074074074 | 49.959 |
| 0.8858564814814814 | 49.958 |
| 0.8858680555555556 | 49.958 |
| 0.8858796296296297 | 49.957 |
| 0.8858912037037037 | 49.956 |
| 0.8859027777777778 | 49.956 |
| 0.8859143518518519 | 49.959 |
| 0.8859259259259259 | 49.964 |
| 0.8859374999999999 | 49.968 |
| 0.8859490740740741 | 49.971 |
| 0.8859606481481482 | 49.974 |
| 0.8859722222222222 | 49.979 |
| 0.8859837962962963 | 49.986 |
| 0.8859953703703703 | 49.994 |
| 0.8860069444444445 | 50.001 |
| 0.8860185185185184 | 50.009 |
| 0.8860300925925926 | 50.015 |
| 0.8860416666666667 | 50.019 |
| 0.8860532407407408 | 50.025 |
| 0.8860648148148148 | 50.028 |
| 0.8860763888888888 | 50.029 |
| 0.886087962962963 | 50.027 |
| 0.8860995370370371 | 50.027 |
| 0.8861111111111111 | 50.025 |
| 0.8861226851851852 | 50.024 |
| 0.8861342592592593 | 50.022 |
| 0.8861458333333333 | 50.02 |
| 0.8861574074074073 | 50.017 |
| 0.8861689814814815 | 50.017 |
| 0.8861805555555556 | 50.014 |
| 0.8861921296296296 | 50.012 |
| 0.8862037037037037 | 50.009 |
| 0.8862152777777778 | 50.011 |
| 0.8862268518518519 | 50.01 |
| 0.8862384259259258 | 50.009 |
| 0.88625 | 50.008 |
| 0.8862615740740741 | 50.009 |
| 0.8862731481481482 | 50.008 |
| 0.8862847222222222 | 50.005 |
| 0.8862962962962962 | 50.003 |
| 0.8863078703703704 | 50.003 |
| 0.8863194444444445 | 50 |
| 0.8863310185185185 | 49.998 |
| 0.8863425925925926 | 50.001 |
| 0.8863541666666667 | 50.002 |
| 0.8863657407407407 | 50.003 |
| 0.8863773148148147 | 50.006 |
| 0.8863888888888889 | 50.01 |
| 0.886400462962963 | 50.011 |
| 0.886412037037037 | 50.011 |
| 0.8864236111111111 | 50.013 |
| 0.8864351851851852 | 50.016 |
| 0.8864467592592593 | 50.016 |
| 0.8864583333333332 | 50.014 |
| 0.8864699074074074 | 50.014 |
| 0.8864814814814815 | 50.013 |
| 0.8864930555555556 | 50.009 |
| 0.8865046296296296 | 50.007 |
| 0.8865162037037037 | 50.003 |
| 0.8865277777777778 | 49.998 |
| 0.886539351851852 | 49.995 |
| 0.8865509259259259 | 49.993 |
| 0.8865625 | 49.992 |
| 0.8865740740740741 | 49.992 |
| 0.8865856481481482 | 49.993 |
| 0.8865972222222221 | 49.995 |
| 0.8866087962962963 | 49.992 |
| 0.8866203703703704 | 49.993 |
| 0.8866319444444444 | 49.996 |
| 0.8866435185185185 | 49.997 |
| 0.8866550925925926 | 49.999 |
| 0.8866666666666667 | 50.004 |
| 0.8866782407407406 | 50.006 |
| 0.8866898148148148 | 50.008 |
| 0.8867013888888889 | 50.012 |
| 0.886712962962963 | 50.01 |
| 0.886724537037037 | 50.008 |
| 0.8867361111111111 | 50.005 |
| 0.8867476851851852 | 50.001 |
| 0.8867592592592594 | 49.998 |
| 0.8867708333333333 | 49.996 |
| 0.8867824074074074 | 49.997 |
| 0.8867939814814815 | 50.002 |
| 0.8868055555555556 | 50.005 |
| 0.8868171296296296 | 50.006 |
| 0.8868287037037037 | 50.007 |
| 0.8868402777777779 | 50.008 |
| 0.8868518518518518 | 50.005 |
| 0.8868634259259259 | 50.001 |
| 0.886875 | 49.997 |
| 0.8868865740740741 | 49.992 |
| 0.886898148148148 | 49.99 |
| 0.8869097222222222 | 49.989 |
| 0.8869212962962963 | 49.99 |
| 0.8869328703703704 | 49.992 |
| 0.8869444444444444 | 49.994 |
| 0.8869560185185185 | 49.996 |
| 0.8869675925925926 | 49.998 |
| 0.8869791666666668 | 50 |
| 0.8869907407407407 | 50.001 |
| 0.8870023148148148 | 50.004 |
| 0.8870138888888889 | 50.007 |
| 0.887025462962963 | 50.013 |
| 0.887037037037037 | 50.016 |
| 0.8870486111111111 | 50.017 |
| 0.8870601851851853 | 50.017 |
| 0.8870717592592593 | 50.016 |
| 0.8870833333333333 | 50.014 |
| 0.8870949074074074 | 50.012 |
| 0.8871064814814815 | 50.011 |
| 0.8871180555555555 | 50.011 |
| 0.8871296296296296 | 50.008 |
| 0.8871412037037038 | 50.004 |
| 0.8871527777777778 | 50.001 |
| 0.8871643518518518 | 49.998 |
| 0.8871759259259259 | 49.997 |
| 0.8871875 | 49.994 |
| 0.8871990740740742 | 49.993 |
| 0.8872106481481481 | 49.993 |
| 0.8872222222222222 | 49.996 |
| 0.8872337962962963 | 49.995 |
| 0.8872453703703704 | 49.994 |
| 0.8872569444444444 | 49.997 |
| 0.8872685185185185 | 49.997 |
| 0.8872800925925927 | 49.999 |
| 0.8872916666666667 | 50.004 |
| 0.8873032407407407 | 50.009 |
| 0.8873148148148148 | 50.016 |
| 0.8873263888888889 | 50.019 |
| 0.8873379629629629 | 50.02 |
| 0.887349537037037 | 50.02 |
| 0.8873611111111112 | 50.019 |
| 0.8873726851851852 | 50.022 |
| 0.8873842592592592 | 50.022 |
| 0.8873958333333333 | 50.019 |
| 0.8874074074074074 | 50.021 |
| 0.8874189814814816 | 50.02 |
| 0.8874305555555555 | 50.018 |
| 0.8874421296296297 | 50.017 |
| 0.8874537037037037 | 50.015 |
| 0.8874652777777778 | 50.013 |
| 0.8874768518518518 | 50.013 |
| 0.8874884259259259 | 50.013 |
| 0.8875000000000001 | 50.012 |
| 0.8875115740740741 | 50.01 |
| 0.8875231481481481 | 50.008 |
| 0.8875347222222222 | 50.007 |
| 0.8875462962962963 | 50.007 |
| 0.8875578703703703 | 50.01 |
| 0.8875694444444444 | 50.009 |
| 0.8875810185185186 | 50.011 |
| 0.8875925925925926 | 50.014 |
| 0.8876041666666666 | 50.013 |
| 0.8876157407407407 | 50.015 |
| 0.8876273148148148 | 50.017 |
| 0.887638888888889 | 50.017 |
| 0.8876504629629629 | 50.017 |
| 0.887662037037037 | 50.018 |
| 0.8876736111111111 | 50.016 |
| 0.8876851851851852 | 50.016 |
| 0.8876967592592592 | 50.017 |
| 0.8877083333333333 | 50.015 |
| 0.8877199074074075 | 50.012 |
| 0.8877314814814815 | 50.01 |
| 0.8877430555555555 | 50.008 |
| 0.8877546296296296 | 50.007 |
| 0.8877662037037037 | 50.008 |
| 0.8877777777777777 | 50.008 |
| 0.8877893518518518 | 50.009 |
| 0.887800925925926 | 50.009 |
| 0.8878125 | 50.005 |
| 0.887824074074074 | 50.002 |
| 0.8878356481481481 | 49.999 |
| 0.8878472222222222 | 49.995 |
| 0.8878587962962964 | 49.991 |
| 0.8878703703703703 | 49.987 |
| 0.8878819444444445 | 49.985 |
| 0.8878935185185185 | 49.985 |
| 0.8879050925925926 | 49.987 |
| 0.8879166666666666 | 49.986 |
| 0.8879282407407407 | 49.99 |
| 0.8879398148148149 | 49.989 |
| 0.8879513888888889 | 49.987 |
| 0.887962962962963 | 49.987 |
| 0.887974537037037 | 49.991 |
| 0.8879861111111111 | 49.99 |
| 0.8879976851851853 | 49.986 |
| 0.8880092592592592 | 49.987 |
| 0.8880208333333334 | 49.985 |
| 0.8880324074074074 | 49.983 |
| 0.8880439814814814 | 49.982 |
| 0.8880555555555555 | 49.983 |
| 0.8880671296296296 | 49.982 |
| 0.8880787037037038 | 49.983 |
| 0.8880902777777777 | 49.983 |
| 0.8881018518518519 | 49.984 |
| 0.8881134259259259 | 49.984 |
| 0.888125 | 49.984 |
| 0.888136574074074 | 49.982 |
| 0.8881481481481481 | 49.978 |
| 0.8881597222222223 | 49.976 |
| 0.8881712962962963 | 49.976 |
| 0.8881828703703704 | 49.971 |
| 0.8881944444444444 | 49.968 |
| 0.8882060185185185 | 49.969 |
| 0.8882175925925927 | 49.971 |
| 0.8882291666666666 | 49.971 |
| 0.8882407407407408 | 49.974 |
| 0.8882523148148148 | 49.977 |
| 0.888263888888889 | 49.977 |
| 0.8882754629629629 | 49.976 |
| 0.888287037037037 | 49.974 |
| 0.8882986111111112 | 49.973 |
| 0.8883101851851851 | 49.968 |
| 0.8883217592592593 | 49.965 |
| 0.8883333333333333 | 49.962 |
| 0.8883449074074075 | 49.959 |
| 0.8883564814814814 | 49.958 |
| 0.8883680555555555 | 49.955 |
| 0.8883796296296297 | 49.954 |
| 0.8883912037037037 | 49.952 |
| 0.8884027777777778 | 49.952 |
| 0.8884143518518518 | 49.953 |
| 0.888425925925926 | 49.955 |
| 0.8884375000000001 | 49.957 |
| 0.888449074074074 | 49.957 |
| 0.8884606481481482 | 49.961 |
| 0.8884722222222222 | 49.961 |
| 0.8884837962962964 | 49.959 |
| 0.8884953703703703 | 49.961 |
| 0.8885069444444444 | 49.959 |
| 0.8885185185185186 | 49.954 |
| 0.8885300925925925 | 49.953 |
| 0.8885416666666667 | 49.953 |
| 0.8885532407407407 | 49.95 |
| 0.8885648148148149 | 49.949 |
| 0.8885763888888888 | 49.948 |
| 0.8885879629629629 | 49.946 |
| 0.8885995370370371 | 49.945 |
| 0.8886111111111111 | 49.944 |
| 0.8886226851851852 | 49.946 |
| 0.8886342592592592 | 49.943 |
| 0.8886458333333334 | 49.939 |
| 0.8886574074074075 | 49.938 |
| 0.8886689814814814 | 49.936 |
| 0.8886805555555556 | 49.935 |
| 0.8886921296296296 | 49.932 |
| 0.8887037037037038 | 49.931 |
| 0.8887152777777777 | 49.932 |
| 0.8887268518518519 | 49.934 |
| 0.888738425925926 | 49.938 |
| 0.8887499999999999 | 49.94 |
| 0.8887615740740741 | 49.943 |
| 0.8887731481481481 | 49.948 |
| 0.8887847222222223 | 49.952 |
| 0.8887962962962962 | 49.955 |
| 0.8888078703703703 | 49.954 |
| 0.8888194444444445 | 49.957 |
| 0.8888310185185185 | 49.956 |
| 0.8888425925925926 | 49.955 |
| 0.8888541666666666 | 49.956 |
| 0.8888657407407408 | 49.956 |
| 0.8888773148148149 | 49.957 |
| 0.8888888888888888 | 49.957 |
| 0.888900462962963 | 49.955 |
| 0.888912037037037 | 49.949 |
| 0.8889236111111112 | 49.945 |
| 0.8889351851851851 | 49.942 |
| 0.8889467592592593 | 49.939 |
| 0.8889583333333334 | 49.937 |
| 0.8889699074074073 | 49.932 |
| 0.8889814814814815 | 49.93 |
| 0.8889930555555555 | 49.931 |
| 0.8890046296296297 | 49.932 |
| 0.8890162037037036 | 49.935 |
| 0.8890277777777778 | 49.936 |
| 0.8890393518518519 | 49.938 |
| 0.8890509259259259 | 49.937 |
| 0.8890625 | 49.937 |
| 0.889074074074074 | 49.937 |
| 0.8890856481481482 | 49.935 |
| 0.8890972222222223 | 49.936 |
| 0.8891087962962962 | 49.938 |
| 0.8891203703703704 | 49.939 |
| 0.8891319444444444 | 49.94 |
| 0.8891435185185186 | 49.941 |
| 0.8891550925925925 | 49.942 |
| 0.8891666666666667 | 49.942 |
| 0.8891782407407408 | 49.941 |
| 0.8891898148148148 | 49.942 |
| 0.8892013888888889 | 49.94 |
| 0.8892129629629629 | 49.941 |
| 0.8892245370370371 | 49.939 |
| 0.889236111111111 | 49.935 |
| 0.8892476851851852 | 49.932 |
| 0.8892592592592593 | 49.93 |
| 0.8892708333333333 | 49.93 |
| 0.8892824074074074 | 49.928 |
| 0.8892939814814814 | 49.927 |
| 0.8893055555555556 | 49.927 |
| 0.8893171296296297 | 49.926 |
| 0.8893287037037036 | 49.926 |
| 0.8893402777777778 | 49.927 |
| 0.8893518518518518 | 49.929 |
| 0.889363425925926 | 49.928 |
| 0.8893749999999999 | 49.929 |
| 0.8893865740740741 | 49.931 |
| 0.8893981481481482 | 49.931 |
| 0.8894097222222223 | 49.935 |
| 0.8894212962962963 | 49.934 |
| 0.8894328703703703 | 49.935 |
| 0.8894444444444445 | 49.935 |
| 0.8894560185185184 | 49.937 |
| 0.8894675925925926 | 49.937 |
| 0.8894791666666667 | 49.937 |
| 0.8894907407407407 | 49.937 |
| 0.8895023148148148 | 49.939 |
| 0.8895138888888888 | 49.937 |
| 0.889525462962963 | 49.935 |
| 0.8895370370370371 | 49.932 |
| 0.889548611111111 | 49.93 |
| 0.8895601851851852 | 49.925 |
| 0.8895717592592592 | 49.923 |
| 0.8895833333333334 | 49.924 |
| 0.8895949074074073 | 49.922 |
| 0.8896064814814815 | 49.922 |
| 0.8896180555555556 | 49.924 |
| 0.8896296296296297 | 49.924 |
| 0.8896412037037037 | 49.926 |
| 0.8896527777777777 | 49.922 |
| 0.8896643518518519 | 49.922 |
| 0.889675925925926 | 49.923 |
| 0.8896875 | 49.921 |
| 0.8896990740740741 | 49.92 |
| 0.8897106481481482 | 49.922 |
| 0.8897222222222222 | 49.924 |
| 0.8897337962962962 | 49.923 |
| 0.8897453703703704 | 49.921 |
| 0.8897569444444445 | 49.921 |
| 0.8897685185185185 | 49.918 |
| 0.8897800925925926 | 49.918 |
| 0.8897916666666666 | 49.913 |
| 0.8898032407407408 | 49.912 |
| 0.8898148148148147 | 49.909 |
| 0.8898263888888889 | 49.905 |
| 0.889837962962963 | 49.902 |
| 0.8898495370370371 | 49.898 |
| 0.8898611111111111 | 49.897 |
| 0.8898726851851851 | 49.899 |
| 0.8898842592592593 | 49.9 |
| 0.8898958333333334 | 49.902 |
| 0.8899074074074074 | 49.901 |
| 0.8899189814814815 | 49.903 |
| 0.8899305555555556 | 49.908 |
| 0.8899421296296296 | 49.911 |
| 0.8899537037037036 | 49.915 |
| 0.8899652777777778 | 49.92 |
| 0.8899768518518519 | 49.922 |
| 0.8899884259259259 | 49.926 |
| 0.89 | 49.928 |
| 0.890011574074074 | 49.929 |
| 0.8900231481481482 | 49.923 |
| 0.8900347222222221 | 49.915 |
| 0.8900462962962963 | 49.907 |
| 0.8900578703703704 | 49.897 |
| 0.8900694444444445 | 49.887 |
| 0.8900810185185185 | 49.881 |
| 0.8900925925925925 | 49.882 |
| 0.8901041666666667 | 49.883 |
| 0.8901157407407408 | 49.885 |
| 0.8901273148148148 | 49.882 |
| 0.8901388888888889 | 49.879 |
| 0.890150462962963 | 49.88 |
| 0.890162037037037 | 49.881 |
| 0.890173611111111 | 49.884 |
| 0.8901851851851852 | 49.888 |
| 0.8901967592592593 | 49.889 |
| 0.8902083333333333 | 49.887 |
| 0.8902199074074074 | 49.885 |
| 0.8902314814814815 | 49.877 |
| 0.8902430555555556 | 49.873 |
| 0.8902546296296295 | 49.871 |
| 0.8902662037037037 | 49.868 |
| 0.8902777777777778 | 49.87 |
| 0.8902893518518519 | 49.872 |
| 0.8903009259259259 | 49.872 |
| 0.8903125 | 49.869 |
| 0.8903240740740741 | 49.87 |
| 0.8903356481481483 | 49.872 |
| 0.8903472222222222 | 49.876 |
| 0.8903587962962963 | 49.882 |
| 0.8903703703703704 | 49.89 |
| 0.8903819444444444 | 49.896 |
| 0.8903935185185184 | 49.9 |
| 0.8904050925925926 | 49.904 |
| 0.8904166666666667 | 49.906 |
| 0.8904282407407407 | 49.908 |
| 0.8904398148148148 | 49.908 |
| 0.8904513888888889 | 49.908 |
| 0.890462962962963 | 49.911 |
| 0.8904745370370369 | 49.914 |
| 0.8904861111111111 | 49.916 |
| 0.8904976851851852 | 49.919 |
| 0.8905092592592593 | 49.923 |
| 0.8905208333333333 | 49.926 |
| 0.8905324074074074 | 49.93 |
| 0.8905439814814815 | 49.933 |
| 0.8905555555555557 | 49.935 |
| 0.8905671296296296 | 49.933 |
| 0.8905787037037037 | 49.934 |
| 0.8905902777777778 | 49.933 |
| 0.8906018518518519 | 49.932 |
| 0.8906134259259259 | 49.934 |
| 0.890625 | 49.935 |
| 0.8906365740740741 | 49.938 |
| 0.8906481481481481 | 49.944 |
| 0.8906597222222222 | 49.946 |
| 0.8906712962962963 | 49.948 |
| 0.8906828703703704 | 49.946 |
| 0.8906944444444443 | 49.945 |
| 0.8907060185185185 | 49.943 |
| 0.8907175925925926 | 49.943 |
| 0.8907291666666667 | 49.942 |
| 0.8907407407407407 | 49.942 |
| 0.8907523148148148 | 49.941 |
| 0.8907638888888889 | 49.943 |
| 0.8907754629629631 | 49.944 |
| 0.890787037037037 | 49.946 |
| 0.8907986111111111 | 49.949 |
| 0.8908101851851852 | 49.953 |
| 0.8908217592592593 | 49.954 |
| 0.8908333333333333 | 49.954 |
| 0.8908449074074074 | 49.957 |
| 0.8908564814814816 | 49.96 |
| 0.8908680555555556 | 49.961 |
| 0.8908796296296296 | 49.96 |
| 0.8908912037037037 | 49.96 |
| 0.8909027777777778 | 49.959 |
| 0.8909143518518517 | 49.959 |
| 0.8909259259259259 | 49.956 |
| 0.8909375 | 49.952 |
| 0.8909490740740741 | 49.948 |
| 0.8909606481481481 | 49.947 |
| 0.8909722222222222 | 49.944 |
| 0.8909837962962963 | 49.941 |
| 0.8909953703703705 | 49.938 |
| 0.8910069444444444 | 49.936 |
| 0.8910185185185185 | 49.936 |
| 0.8910300925925926 | 49.934 |
| 0.8910416666666667 | 49.934 |
| 0.8910532407407407 | 49.935 |
| 0.8910648148148148 | 49.938 |
| 0.891076388888889 | 49.941 |
| 0.891087962962963 | 49.947 |
| 0.891099537037037 | 49.951 |
| 0.8911111111111111 | 49.952 |
| 0.8911226851851852 | 49.955 |
| 0.8911342592592592 | 49.958 |
| 0.8911458333333333 | 49.956 |
| 0.8911574074074075 | 49.954 |
| 0.8911689814814815 | 49.954 |
| 0.8911805555555555 | 49.954 |
| 0.8911921296296296 | 49.955 |
| 0.8912037037037037 | 49.957 |
| 0.8912152777777779 | 49.961 |
| 0.8912268518518518 | 49.969 |
| 0.891238425925926 | 49.976 |
| 0.89125 | 49.981 |
| 0.8912615740740741 | 49.983 |
| 0.8912731481481481 | 49.984 |
| 0.8912847222222222 | 49.986 |
| 0.8912962962962964 | 49.989 |
| 0.8913078703703704 | 49.988 |
| 0.8913194444444444 | 49.989 |
| 0.8913310185185185 | 49.99 |
| 0.8913425925925926 | 49.99 |
| 0.8913541666666666 | 49.99 |
| 0.8913657407407407 | 49.99 |
| 0.8913773148148149 | 49.99 |
| 0.8913888888888889 | 49.992 |
| 0.8914004629629629 | 49.994 |
| 0.891412037037037 | 49.995 |
| 0.8914236111111111 | 49.999 |
| 0.8914351851851853 | 50.002 |
| 0.8914467592592592 | 50.007 |
| 0.8914583333333334 | 50.014 |
| 0.8914699074074074 | 50.016 |
| 0.8914814814814815 | 50.019 |
| 0.8914930555555555 | 50.018 |
| 0.8915046296296296 | 50.019 |
| 0.8915162037037038 | 50.019 |
| 0.8915277777777778 | 50.019 |
| 0.8915393518518518 | 50.018 |
| 0.8915509259259259 | 50.019 |
| 0.8915625 | 50.02 |
| 0.891574074074074 | 50.019 |
| 0.8915856481481481 | 50.02 |
| 0.8915972222222223 | 50.022 |
| 0.8916087962962963 | 50.024 |
| 0.8916203703703703 | 50.023 |
| 0.8916319444444444 | 50.025 |
| 0.8916435185185185 | 50.024 |
| 0.8916550925925927 | 50.021 |